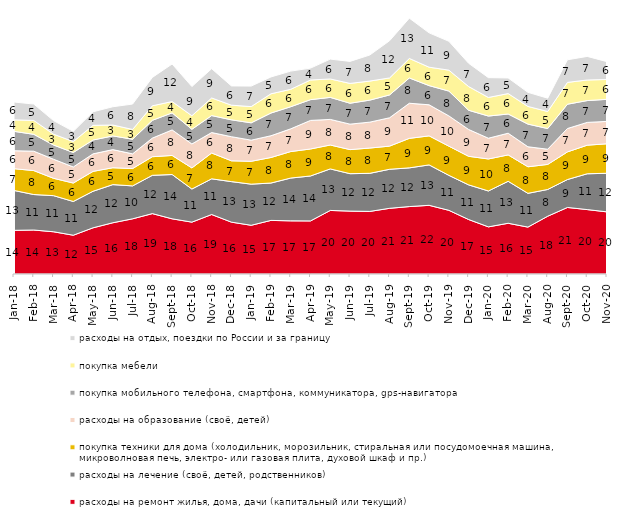
| Category | расходы на ремонт жилья, дома, дачи (капитальный или текущий) | расходы на лечение (своё, детей, родственников) | покупка техники для дома (холодильник, морозильник, стиральная или посудомоечная машина, микроволновая печь, электро- или газовая плита, духовой шкаф и пр.) | расходы на образование (своё, детей) | покупка мобильного телефона, смартфона, коммуникатора, gps-навигатора | покупка мебели | расходы на отдых, поездки по России и за границу |
|---|---|---|---|---|---|---|---|
| 2018-01-01 | 13.85 | 12.65 | 6.9 | 5.7 | 6.15 | 3.65 | 5.65 |
| 2018-02-01 | 13.95 | 11.25 | 7.6 | 6.15 | 5.35 | 4.4 | 5.2 |
| 2018-03-01 | 13.4 | 11.45 | 5.5 | 6.05 | 4.5 | 3.45 | 4.3 |
| 2018-04-01 | 12.3 | 10.7 | 5.85 | 5.1 | 4.6 | 3.45 | 3.25 |
| 2018-05-01 | 14.65 | 11.6 | 6.3 | 5.55 | 4.4 | 4.65 | 4.3 |
| 2018-06-01 | 16.25 | 12.1 | 5.35 | 5.75 | 4.35 | 3.45 | 5.8 |
| 2018-07-01 | 17.5 | 10.45 | 5.5 | 4.65 | 4.65 | 3.1 | 8.05 |
| 2018-08-01 | 19.15 | 12.15 | 5.9 | 5.9 | 5.65 | 4.6 | 9 |
| 2018-09-01 | 17.5 | 14.05 | 6.05 | 8.1 | 5.4 | 3.6 | 11.9 |
| 2018-10-01 | 16.45 | 10.5 | 6.7 | 7.6 | 4.65 | 4.3 | 9.25 |
| 2018-11-01 | 18.862 | 11.327 | 8.184 | 6.487 | 5.389 | 5.589 | 9.281 |
| 2018-12-01 | 16.45 | 12.85 | 6.6 | 7.65 | 5.35 | 4.65 | 6.1 |
| 2019-01-01 | 15.45 | 13.05 | 7.25 | 6.7 | 5.5 | 5.15 | 6.5 |
| 2019-02-01 | 17 | 11.85 | 8.1 | 6.9 | 7.2 | 6.1 | 5.35 |
| 2019-03-01 | 16.857 | 13.575 | 8.404 | 7.21 | 7.011 | 5.52 | 5.768 |
| 2019-04-01 | 16.832 | 14.257 | 8.564 | 9.059 | 6.584 | 6.238 | 3.762 |
| 2019-05-01 | 20.158 | 13.175 | 7.578 | 8.123 | 6.984 | 5.844 | 6.29 |
| 2019-06-01 | 19.95 | 11.87 | 7.631 | 8.08 | 6.633 | 6.284 | 6.983 |
| 2019-07-01 | 19.851 | 12.079 | 8.02 | 8.218 | 6.98 | 6.04 | 8.267 |
| 2019-08-01 | 20.829 | 12.388 | 7.343 | 8.991 | 7.243 | 5.395 | 11.788 |
| 2019-09-01 | 21.386 | 12.277 | 9.356 | 11.139 | 8.02 | 6.188 | 12.772 |
| 2019-10-01 | 21.782 | 12.822 | 9.208 | 9.851 | 6.089 | 5.842 | 10.891 |
| 2019-11-01 | 20.198 | 11.089 | 9.257 | 9.604 | 7.871 | 6.634 | 9.158 |
| 2019-12-01 | 17.277 | 10.99 | 9.059 | 8.515 | 6.089 | 7.525 | 7.376 |
| 2020-01-01 | 14.95 | 11.386 | 10.149 | 6.584 | 7.03 | 5.891 | 6.287 |
| 2020-02-01 | 16.089 | 13.317 | 8.366 | 6.881 | 6.089 | 6.485 | 4.95 |
| 2020-03-01 | 14.874 | 10.709 | 8.428 | 6.346 | 7.189 | 5.602 | 4.462 |
| 2020-08-01 | 18.322 | 8.491 | 7.944 | 4.816 | 6.554 | 5.412 | 4.22 |
| 2020-09-01 | 21.105 | 8.86 | 8.761 | 7.417 | 7.715 | 6.919 | 7.168 |
| 2020-10-01 | 20.428 | 11.36 | 9.068 | 7.225 | 6.926 | 6.527 | 7.474 |
| 2020-11-01 | 19.7 | 12.25 | 9.35 | 7.1 | 7 | 6.3 | 5.65 |